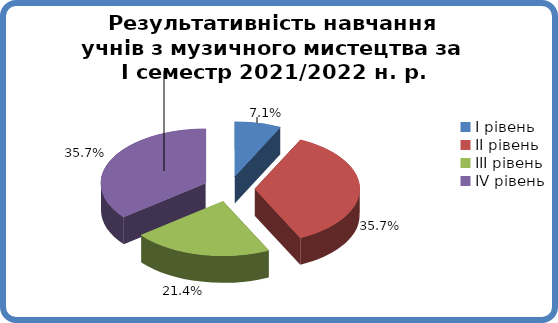
| Category | Series 0 |
|---|---|
| 0 | 0.071 |
| 1 | 0.357 |
| 2 | 0.214 |
| 3 | 0.357 |